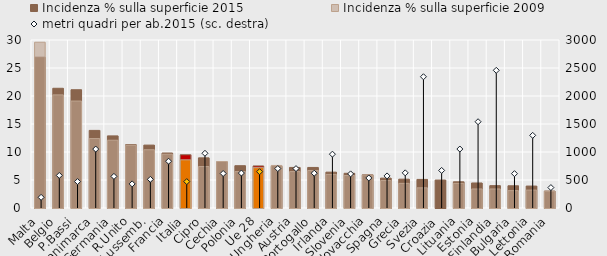
| Category | Incidenza % sulla superficie |
|---|---|
| Malta | 29.6 |
| Belgio | 20.2 |
| P.Bassi | 19.1 |
| Danimarca | 12.4 |
| Germania | 12.1 |
| R.Unito | 11.2 |
| Lussemb. | 10.4 |
| Francia | 9.6 |
| Italia | 8.6 |
| Cipro | 7.4 |
| Cechia | 8.3 |
| Polonia | 6.5 |
| Ue 28 | 7.2 |
| Ungheria | 7.6 |
| Austria | 6.5 |
| Portogallo | 6.7 |
| Irlanda | 6 |
| Slovenia | 5.8 |
| Slovacchia | 5.9 |
| Spagna | 4.9 |
| Grecia | 4.4 |
| Svezia | 3.6 |
| Croazia | 0 |
| Lituania | 4.4 |
| Estonia | 3.4 |
| Finlandia | 3.4 |
| Bulgaria | 3.1 |
| Lettonia | 3.2 |
| Romania | 3 |